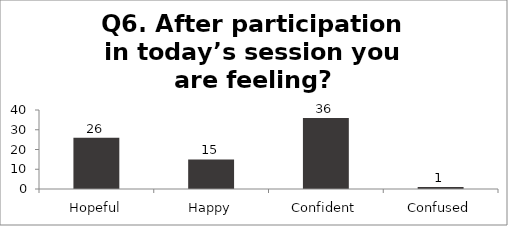
| Category | Q6. After participation in today’s session you are feeling? |
|---|---|
| Hopeful | 26 |
| Happy | 15 |
| Confident | 36 |
| Confused | 1 |